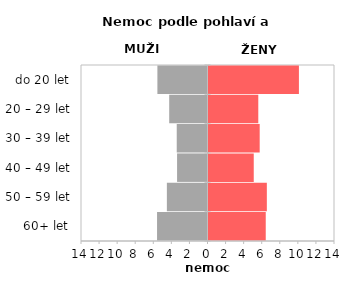
| Category | Nemoc |
|---|---|
| 60+ let | 6.335 |
| 50 – 59 let | 6.457 |
| 40 – 49 let | 5.008 |
| 30 – 39 let | 5.665 |
| 20 – 29 let | 5.511 |
| do 20 let | 10.007 |